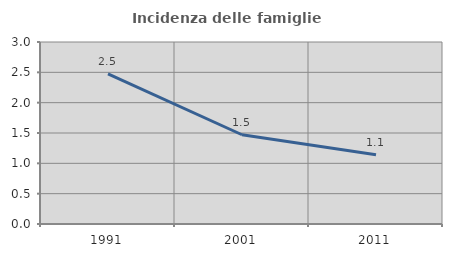
| Category | Incidenza delle famiglie numerose |
|---|---|
| 1991.0 | 2.476 |
| 2001.0 | 1.471 |
| 2011.0 | 1.143 |